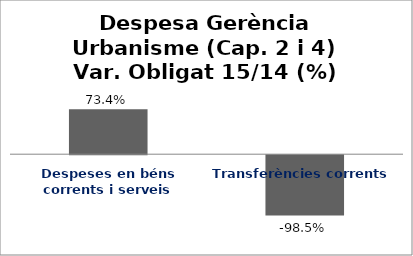
| Category | Series 0 |
|---|---|
| Despeses en béns corrents i serveis | 0.734 |
| Transferències corrents | -0.985 |